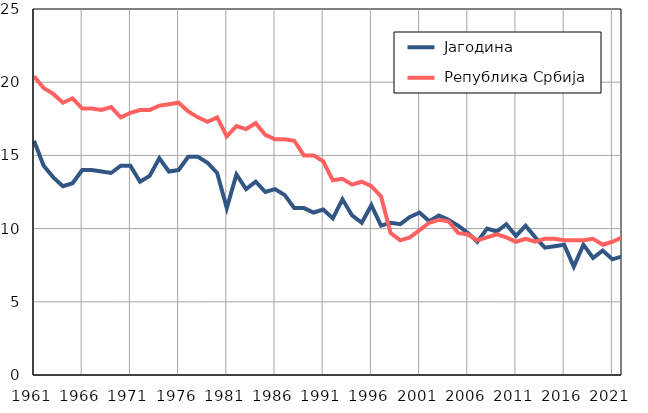
| Category |  Јагодина |  Република Србија |
|---|---|---|
| 1961.0 | 16 | 20.4 |
| 1962.0 | 14.3 | 19.6 |
| 1963.0 | 13.5 | 19.2 |
| 1964.0 | 12.9 | 18.6 |
| 1965.0 | 13.1 | 18.9 |
| 1966.0 | 14 | 18.2 |
| 1967.0 | 14 | 18.2 |
| 1968.0 | 13.9 | 18.1 |
| 1969.0 | 13.8 | 18.3 |
| 1970.0 | 14.3 | 17.6 |
| 1971.0 | 14.3 | 17.9 |
| 1972.0 | 13.2 | 18.1 |
| 1973.0 | 13.6 | 18.1 |
| 1974.0 | 14.8 | 18.4 |
| 1975.0 | 13.9 | 18.5 |
| 1976.0 | 14 | 18.6 |
| 1977.0 | 14.9 | 18 |
| 1978.0 | 14.9 | 17.6 |
| 1979.0 | 14.5 | 17.3 |
| 1980.0 | 13.8 | 17.6 |
| 1981.0 | 11.4 | 16.3 |
| 1982.0 | 13.7 | 17 |
| 1983.0 | 12.7 | 16.8 |
| 1984.0 | 13.2 | 17.2 |
| 1985.0 | 12.5 | 16.4 |
| 1986.0 | 12.7 | 16.1 |
| 1987.0 | 12.3 | 16.1 |
| 1988.0 | 11.4 | 16 |
| 1989.0 | 11.4 | 15 |
| 1990.0 | 11.1 | 15 |
| 1991.0 | 11.3 | 14.6 |
| 1992.0 | 10.7 | 13.3 |
| 1993.0 | 12 | 13.4 |
| 1994.0 | 10.9 | 13 |
| 1995.0 | 10.4 | 13.2 |
| 1996.0 | 11.6 | 12.9 |
| 1997.0 | 10.2 | 12.2 |
| 1998.0 | 10.4 | 9.7 |
| 1999.0 | 10.3 | 9.2 |
| 2000.0 | 10.8 | 9.4 |
| 2001.0 | 11.1 | 9.9 |
| 2002.0 | 10.5 | 10.4 |
| 2003.0 | 10.9 | 10.6 |
| 2004.0 | 10.6 | 10.5 |
| 2005.0 | 10.2 | 9.7 |
| 2006.0 | 9.7 | 9.6 |
| 2007.0 | 9.1 | 9.2 |
| 2008.0 | 10 | 9.4 |
| 2009.0 | 9.8 | 9.6 |
| 2010.0 | 10.3 | 9.4 |
| 2011.0 | 9.5 | 9.1 |
| 2012.0 | 10.2 | 9.3 |
| 2013.0 | 9.4 | 9.1 |
| 2014.0 | 8.7 | 9.3 |
| 2015.0 | 8.8 | 9.3 |
| 2016.0 | 8.9 | 9.2 |
| 2017.0 | 7.4 | 9.2 |
| 2018.0 | 8.9 | 9.2 |
| 2019.0 | 8 | 9.3 |
| 2020.0 | 8.5 | 8.9 |
| 2021.0 | 7.9 | 9.1 |
| 2022.0 | 8.1 | 9.4 |